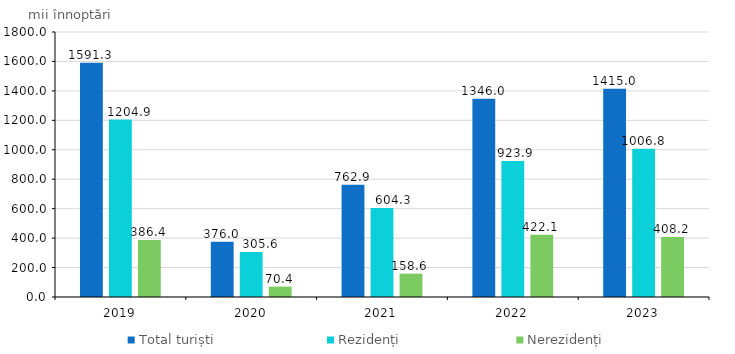
| Category | Total turiști | Rezidenți  | Nerezidenți |
|---|---|---|---|
| 2019.0 | 1591.3 | 1204.9 | 386.4 |
| 2020.0 | 376 | 305.6 | 70.4 |
| 2021.0 | 762.9 | 604.3 | 158.6 |
| 2022.0 | 1346 | 923.9 | 422.1 |
| 2023.0 | 1415 | 1006.8 | 408.2 |